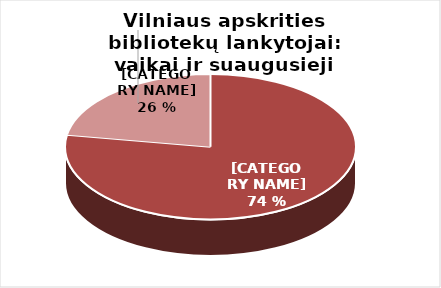
| Category | Series 0 |
|---|---|
| Suaugusieji | 1080196 |
| Vaikai | 310767 |